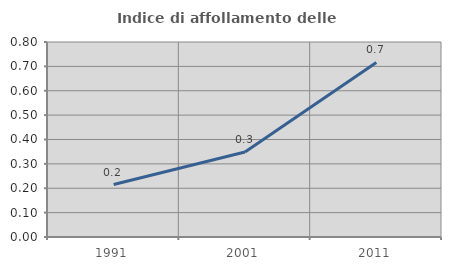
| Category | Indice di affollamento delle abitazioni  |
|---|---|
| 1991.0 | 0.215 |
| 2001.0 | 0.348 |
| 2011.0 | 0.716 |